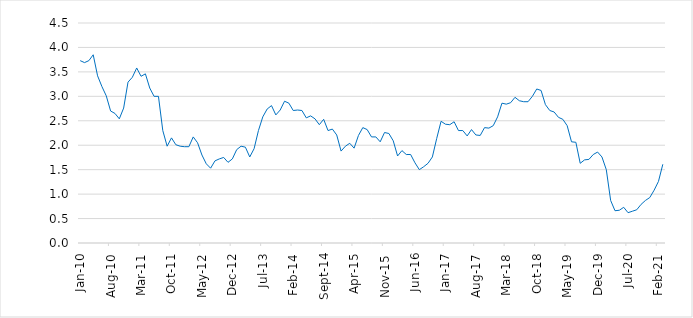
| Category | Series 0 |
|---|---|
| 2010-01-01 | 3.73 |
| 2010-02-01 | 3.69 |
| 2010-03-01 | 3.73 |
| 2010-04-01 | 3.85 |
| 2010-05-01 | 3.42 |
| 2010-06-01 | 3.2 |
| 2010-07-01 | 3.01 |
| 2010-08-01 | 2.7 |
| 2010-09-01 | 2.65 |
| 2010-10-01 | 2.54 |
| 2010-11-01 | 2.76 |
| 2010-12-01 | 3.29 |
| 2011-01-01 | 3.39 |
| 2011-02-01 | 3.58 |
| 2011-03-01 | 3.41 |
| 2011-04-01 | 3.46 |
| 2011-05-01 | 3.17 |
| 2011-06-01 | 3 |
| 2011-07-01 | 3 |
| 2011-08-01 | 2.3 |
| 2011-09-01 | 1.98 |
| 2011-10-01 | 2.15 |
| 2011-11-01 | 2.01 |
| 2011-12-01 | 1.98 |
| 2012-01-01 | 1.97 |
| 2012-02-01 | 1.97 |
| 2012-03-01 | 2.17 |
| 2012-04-01 | 2.05 |
| 2012-05-01 | 1.8 |
| 2012-06-01 | 1.62 |
| 2012-07-01 | 1.53 |
| 2012-08-01 | 1.68 |
| 2012-09-01 | 1.72 |
| 2012-10-01 | 1.75 |
| 2012-11-01 | 1.65 |
| 2012-12-01 | 1.72 |
| 2013-01-01 | 1.91 |
| 2013-02-01 | 1.98 |
| 2013-03-01 | 1.96 |
| 2013-04-01 | 1.76 |
| 2013-05-01 | 1.93 |
| 2013-06-01 | 2.3 |
| 2013-07-01 | 2.58 |
| 2013-08-01 | 2.74 |
| 2013-09-01 | 2.81 |
| 2013-10-01 | 2.62 |
| 2013-11-01 | 2.72 |
| 2013-12-01 | 2.9 |
| 2014-01-01 | 2.86 |
| 2014-02-01 | 2.71 |
| 2014-03-01 | 2.72 |
| 2014-04-01 | 2.71 |
| 2014-05-01 | 2.56 |
| 2014-06-01 | 2.6 |
| 2014-07-01 | 2.54 |
| 2014-08-01 | 2.42 |
| 2014-09-01 | 2.53 |
| 2014-10-01 | 2.3 |
| 2014-11-01 | 2.33 |
| 2014-12-01 | 2.21 |
| 2015-01-01 | 1.88 |
| 2015-02-01 | 1.98 |
| 2015-03-01 | 2.04 |
| 2015-04-01 | 1.94 |
| 2015-05-01 | 2.2 |
| 2015-06-01 | 2.36 |
| 2015-07-01 | 2.32 |
| 2015-08-01 | 2.17 |
| 2015-09-01 | 2.17 |
| 2015-10-01 | 2.07 |
| 2015-11-01 | 2.26 |
| 2015-12-01 | 2.24 |
| 2016-01-01 | 2.09 |
| 2016-02-01 | 1.78 |
| 2016-03-01 | 1.89 |
| 2016-04-01 | 1.81 |
| 2016-05-01 | 1.81 |
| 2016-06-01 | 1.64 |
| 2016-07-01 | 1.5 |
| 2016-08-01 | 1.56 |
| 2016-09-01 | 1.63 |
| 2016-10-01 | 1.76 |
| 2016-11-01 | 2.14 |
| 2016-12-01 | 2.49 |
| 2017-01-01 | 2.43 |
| 2017-02-01 | 2.42 |
| 2017-03-01 | 2.48 |
| 2017-04-01 | 2.3 |
| 2017-05-01 | 2.3 |
| 2017-06-01 | 2.19 |
| 2017-07-01 | 2.32 |
| 2017-08-01 | 2.21 |
| 2017-09-01 | 2.2 |
| 2017-10-01 | 2.36 |
| 2017-11-01 | 2.35 |
| 2017-12-01 | 2.4 |
| 2018-01-01 | 2.58 |
| 2018-02-01 | 2.86 |
| 2018-03-01 | 2.84 |
| 2018-04-01 | 2.87 |
| 2018-05-01 | 2.98 |
| 2018-06-01 | 2.91 |
| 2018-07-01 | 2.89 |
| 2018-08-01 | 2.89 |
| 2018-09-01 | 3 |
| 2018-10-01 | 3.15 |
| 2018-11-01 | 3.12 |
| 2018-12-01 | 2.83 |
| 2019-01-01 | 2.71 |
| 2019-02-01 | 2.68 |
| 2019-03-01 | 2.57 |
| 2019-04-01 | 2.53 |
| 2019-05-01 | 2.4 |
| 2019-06-01 | 2.07 |
| 2019-07-01 | 2.06 |
| 2019-08-01 | 1.63 |
| 2019-09-01 | 1.7 |
| 2019-10-01 | 1.71 |
| 2019-11-01 | 1.81 |
| 2019-12-01 | 1.86 |
| 2020-01-01 | 1.76 |
| 2020-02-01 | 1.5 |
| 2020-03-01 | 0.87 |
| 2020-04-01 | 0.66 |
| 2020-05-01 | 0.67 |
| 2020-06-01 | 0.73 |
| 2020-07-01 | 0.62 |
| 2020-08-01 | 0.65 |
| 2020-09-01 | 0.68 |
| 2020-10-01 | 0.79 |
| 2020-11-01 | 0.87 |
| 2020-12-01 | 0.93 |
| 2021-01-01 | 1.08 |
| 2021-02-01 | 1.26 |
| 2021-03-01 | 1.61 |